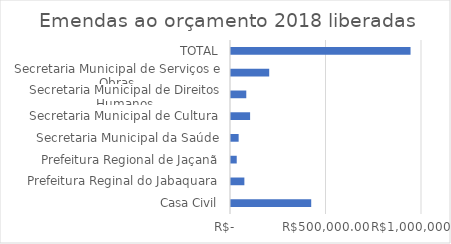
| Category | Series 0 |
|---|---|
| Casa Civil | 420000 |
| Prefeitura Reginal do Jabaquara | 70000 |
| Prefeitura Regional de Jaçanã | 30000 |
| Secretaria Municipal da Saúde | 40000 |
| Secretaria Municipal de Cultura | 100000 |
| Secretaria Municipal de Direitos Humanos | 80000 |
| Secretaria Municipal de Serviços e Obras | 200000 |
| TOTAL | 940000 |